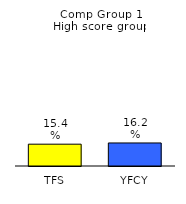
| Category | Series 0 |
|---|---|
| TFS | 0.154 |
| YFCY | 0.162 |